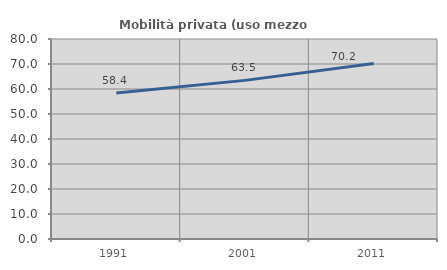
| Category | Mobilità privata (uso mezzo privato) |
|---|---|
| 1991.0 | 58.442 |
| 2001.0 | 63.452 |
| 2011.0 | 70.238 |